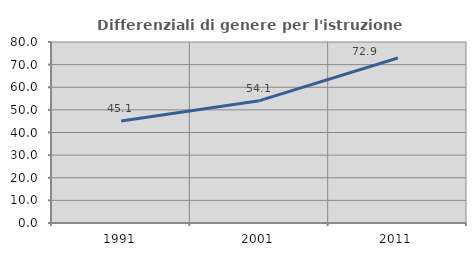
| Category | Differenziali di genere per l'istruzione superiore |
|---|---|
| 1991.0 | 45.084 |
| 2001.0 | 54.061 |
| 2011.0 | 72.927 |